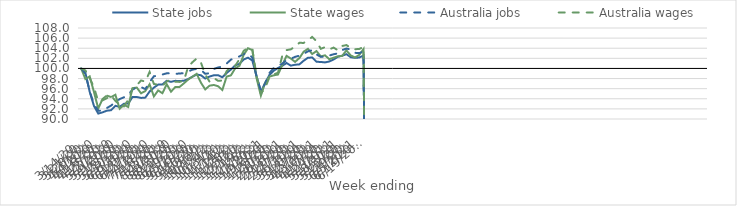
| Category | State jobs | State wages | Australia jobs | Australia wages |
|---|---|---|---|---|
| 14/03/2020 | 100 | 100 | 100 | 100 |
| 21/03/2020 | 99.134 | 97.901 | 98.971 | 99.604 |
| 28/03/2020 | 95.372 | 98.426 | 95.467 | 98.106 |
| 04/04/2020 | 92.58 | 95.324 | 92.922 | 96.239 |
| 11/04/2020 | 91.072 | 92.08 | 91.648 | 93.488 |
| 18/04/2020 | 91.317 | 93.955 | 91.632 | 93.693 |
| 25/04/2020 | 91.641 | 94.635 | 92.163 | 94.114 |
| 02/05/2020 | 91.733 | 94.335 | 92.661 | 94.661 |
| 09/05/2020 | 92.61 | 94.796 | 93.345 | 93.586 |
| 16/05/2020 | 92.391 | 92.033 | 93.938 | 92.82 |
| 23/05/2020 | 93.021 | 92.787 | 94.296 | 92.472 |
| 30/05/2020 | 93.06 | 92.377 | 94.804 | 93.802 |
| 06/06/2020 | 94.352 | 96.096 | 95.79 | 95.983 |
| 13/06/2020 | 94.357 | 96.222 | 96.291 | 96.659 |
| 20/06/2020 | 94.166 | 95.082 | 96.307 | 97.626 |
| 27/06/2020 | 94.233 | 95.534 | 95.924 | 97.398 |
| 04/07/2020 | 95.442 | 96.864 | 97.286 | 99.305 |
| 11/07/2020 | 96.204 | 94.464 | 98.453 | 96.936 |
| 18/07/2020 | 96.805 | 95.651 | 98.574 | 96.771 |
| 25/07/2020 | 96.842 | 95.101 | 98.8 | 96.557 |
| 01/08/2020 | 97.566 | 96.876 | 99.036 | 97.398 |
| 08/08/2020 | 97.356 | 95.404 | 99.039 | 97.865 |
| 15/08/2020 | 97.549 | 96.32 | 98.915 | 97.373 |
| 22/08/2020 | 97.508 | 96.338 | 99.01 | 97.336 |
| 29/08/2020 | 97.567 | 97.043 | 99.05 | 97.544 |
| 05/09/2020 | 97.886 | 97.797 | 99.381 | 100.291 |
| 12/09/2020 | 98.374 | 98.356 | 99.754 | 101.228 |
| 19/09/2020 | 98.788 | 98.93 | 99.918 | 101.971 |
| 26/09/2020 | 98.652 | 97.176 | 99.725 | 101.154 |
| 03/10/2020 | 98.001 | 95.852 | 98.937 | 98.795 |
| 10/10/2020 | 98.389 | 96.589 | 99.064 | 97.403 |
| 17/10/2020 | 98.646 | 96.73 | 99.896 | 98.12 |
| 24/10/2020 | 98.662 | 96.484 | 100.185 | 97.546 |
| 31/10/2020 | 98.258 | 95.739 | 100.363 | 97.615 |
| 07/11/2020 | 99.102 | 98.389 | 100.966 | 99.446 |
| 14/11/2020 | 99.785 | 98.628 | 101.741 | 100.424 |
| 21/11/2020 | 100.586 | 100.014 | 102.085 | 100.522 |
| 28/11/2020 | 100.908 | 100.528 | 102.383 | 101.813 |
| 05/12/2020 | 101.782 | 102.707 | 102.872 | 103.509 |
| 12/12/2020 | 102.129 | 104.002 | 102.957 | 104.014 |
| 19/12/2020 | 101.573 | 103.629 | 102.168 | 103.915 |
| 26/12/2020 | 98.497 | 98.078 | 98.391 | 98.452 |
| 02/01/2021 | 95.385 | 94.629 | 95.58 | 95.006 |
| 09/01/2021 | 97.136 | 97.164 | 96.988 | 96.148 |
| 16/01/2021 | 98.705 | 98.373 | 99.101 | 98.251 |
| 23/01/2021 | 99.543 | 98.637 | 100.068 | 98.817 |
| 30/01/2021 | 100.084 | 98.792 | 100.556 | 99.148 |
| 06/02/2021 | 100.521 | 100.645 | 100.923 | 102.467 |
| 13/02/2021 | 101.071 | 102.487 | 101.643 | 103.619 |
| 20/02/2021 | 100.558 | 101.964 | 101.902 | 103.78 |
| 27/02/2021 | 100.729 | 101.301 | 102.3 | 104.333 |
| 06/03/2021 | 100.805 | 102.045 | 102.521 | 105.064 |
| 13/03/2021 | 101.523 | 103.305 | 102.877 | 105.052 |
| 20/03/2021 | 102.116 | 103.88 | 103.384 | 105.539 |
| 27/03/2021 | 102.159 | 102.854 | 103.612 | 106.245 |
| 03/04/2021 | 101.316 | 103.437 | 102.769 | 105.395 |
| 10/04/2021 | 101.282 | 102.388 | 102.293 | 103.884 |
| 17/04/2021 | 101.193 | 102.588 | 102.308 | 104.211 |
| 24/04/2021 | 101.377 | 101.833 | 102.558 | 103.772 |
| 01/05/2021 | 101.771 | 102.126 | 102.806 | 104.122 |
| 08/05/2021 | 102.308 | 102.4 | 102.974 | 103.594 |
| 15/05/2021 | 102.518 | 102.478 | 103.642 | 104.439 |
| 22/05/2021 | 102.822 | 103.573 | 103.934 | 104.625 |
| 29/05/2021 | 102.227 | 102.575 | 103.744 | 104.038 |
| 05/06/2021 | 102.093 | 102.164 | 103.091 | 103.805 |
| 12/06/2021 | 102.163 | 102.678 | 103.033 | 103.851 |
| 19/06/2021 | 102.562 | 103.842 | 103.366 | 104.254 |